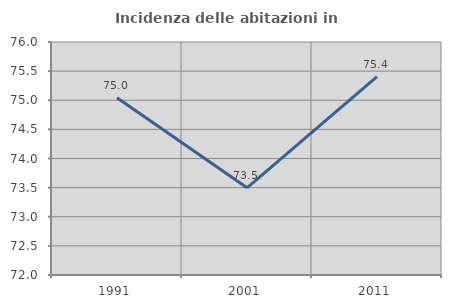
| Category | Incidenza delle abitazioni in proprietà  |
|---|---|
| 1991.0 | 75.043 |
| 2001.0 | 73.497 |
| 2011.0 | 75.404 |